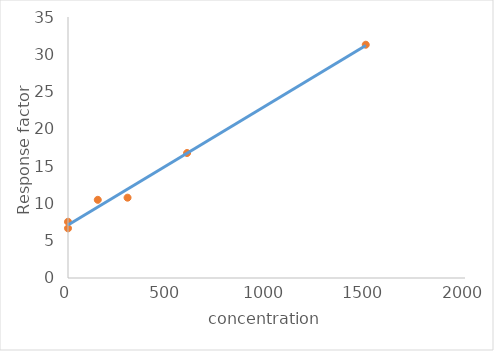
| Category | Series 0 |
|---|---|
| 0.0 | 7.543 |
| 0.0 | 6.656 |
| nan | 0 |
| 150.0 | 10.484 |
| 300.0 | 10.77 |
| 600.0 | 16.761 |
| 1500.0 | 31.282 |
| nan | 0 |
| nan | 0 |